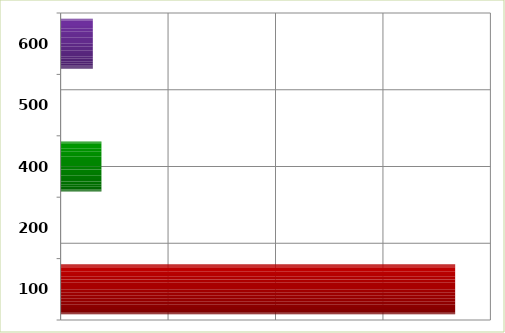
| Category | Series 0 |
|---|---|
| 100.0 | 3672000 |
| 200.0 | 0 |
| 400.0 | 380000 |
| 500.0 | 0 |
| 600.0 | 300000 |